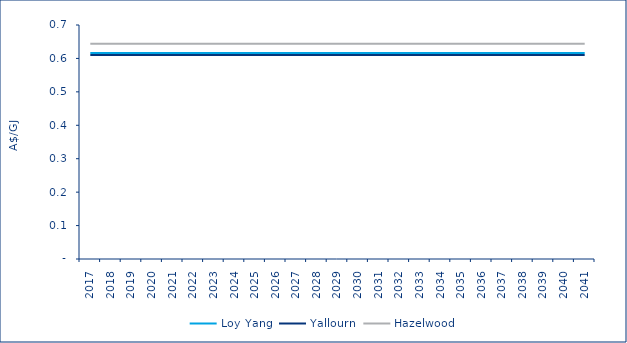
| Category | Loy Yang | Yallourn | Hazelwood |
|---|---|---|---|
| 2017.0 | 0.616 | 0.61 | 0.644 |
| 2018.0 | 0.616 | 0.61 | 0.644 |
| 2019.0 | 0.616 | 0.61 | 0.644 |
| 2020.0 | 0.616 | 0.61 | 0.644 |
| 2021.0 | 0.616 | 0.61 | 0.644 |
| 2022.0 | 0.616 | 0.61 | 0.644 |
| 2023.0 | 0.616 | 0.61 | 0.644 |
| 2024.0 | 0.616 | 0.61 | 0.644 |
| 2025.0 | 0.616 | 0.61 | 0.644 |
| 2026.0 | 0.616 | 0.61 | 0.644 |
| 2027.0 | 0.616 | 0.61 | 0.644 |
| 2028.0 | 0.616 | 0.61 | 0.644 |
| 2029.0 | 0.616 | 0.61 | 0.644 |
| 2030.0 | 0.616 | 0.61 | 0.644 |
| 2031.0 | 0.616 | 0.61 | 0.644 |
| 2032.0 | 0.616 | 0.61 | 0.644 |
| 2033.0 | 0.616 | 0.61 | 0.644 |
| 2034.0 | 0.616 | 0.61 | 0.644 |
| 2035.0 | 0.616 | 0.61 | 0.644 |
| 2036.0 | 0.616 | 0.61 | 0.644 |
| 2037.0 | 0.616 | 0.61 | 0.644 |
| 2038.0 | 0.616 | 0.61 | 0.644 |
| 2039.0 | 0.616 | 0.61 | 0.644 |
| 2040.0 | 0.616 | 0.61 | 0.644 |
| 2041.0 | 0.616 | 0.61 | 0.644 |